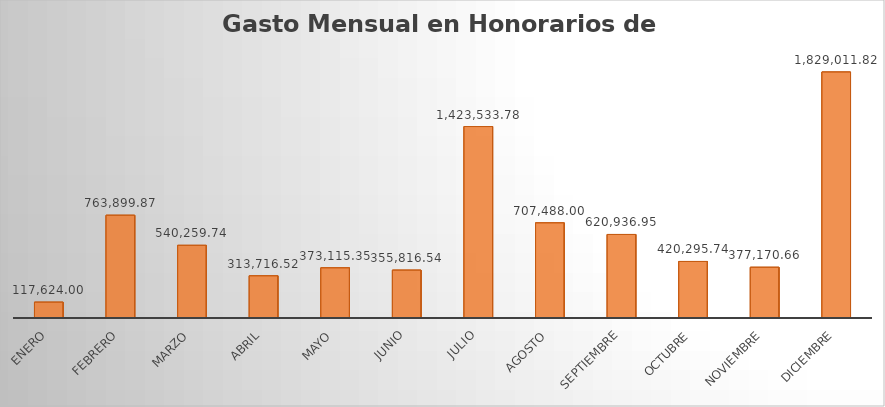
| Category | Monto |
|---|---|
| ENERO | 117624 |
| FEBRERO | 763899.87 |
| MARZO | 540259.74 |
| ABRIL | 313716.52 |
| MAYO | 373115.35 |
| JUNIO | 355816.54 |
| JULIO | 1423533.78 |
| AGOSTO | 707488 |
| SEPTIEMBRE | 620936.95 |
| OCTUBRE | 420295.74 |
| NOVIEMBRE | 377170.66 |
| DICIEMBRE | 1829011.82 |